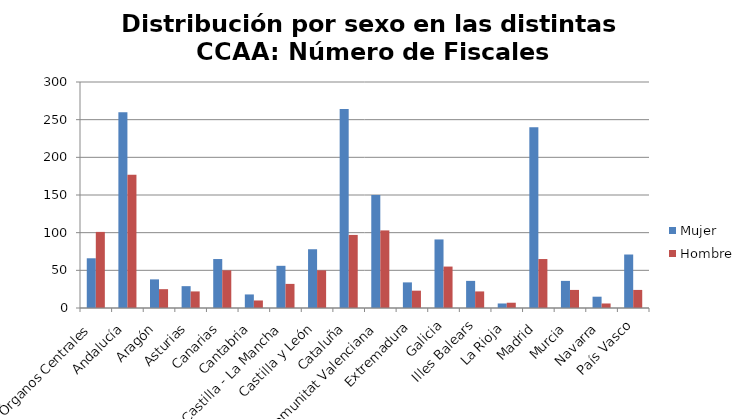
| Category | Mujer | Hombre |
|---|---|---|
| Órganos Centrales | 66 | 101 |
| Andalucía | 260 | 177 |
| Aragón | 38 | 25 |
| Asturias | 29 | 22 |
| Canarias | 65 | 50 |
| Cantabria | 18 | 10 |
| Castilla - La Mancha | 56 | 32 |
| Castilla y León | 78 | 50 |
| Cataluña | 264 | 97 |
| Comunitat Valenciana | 150 | 103 |
| Extremadura | 34 | 23 |
| Galicia | 91 | 55 |
| Illes Balears | 36 | 22 |
| La Rioja | 6 | 7 |
| Madrid | 240 | 65 |
| Murcia | 36 | 24 |
| Navarra | 15 | 6 |
| País Vasco | 71 | 24 |